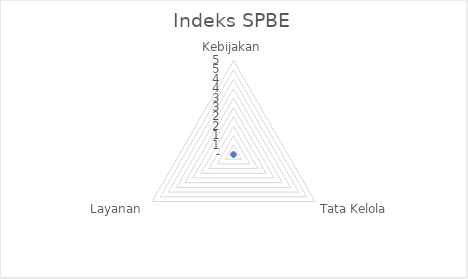
| Category | Series 0 |
|---|---|
| Kebijakan | 0 |
| Tata Kelola | 0 |
| Layanan | 0 |